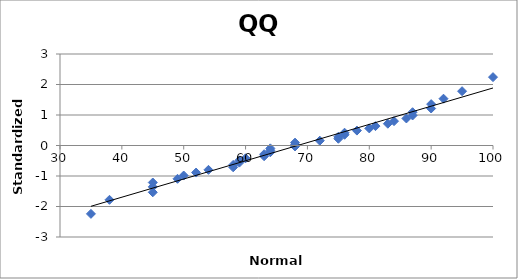
| Category | Series 0 |
|---|---|
| 35.0 | -2.241 |
| 38.0 | -1.78 |
| 45.0 | -1.534 |
| 45.0 | -1.356 |
| 45.0 | -1.213 |
| 49.0 | -1.092 |
| 50.0 | -0.984 |
| 52.0 | -0.887 |
| 54.0 | -0.798 |
| 58.0 | -0.714 |
| 58.0 | -0.636 |
| 59.0 | -0.561 |
| 59.0 | -0.489 |
| 60.0 | -0.419 |
| 63.0 | -0.352 |
| 63.0 | -0.286 |
| 64.0 | -0.221 |
| 64.0 | -0.157 |
| 64.0 | -0.094 |
| 68.0 | -0.031 |
| 68.0 | 0.031 |
| 68.0 | 0.094 |
| 72.0 | 0.157 |
| 75.0 | 0.221 |
| 75.0 | 0.286 |
| 76.0 | 0.352 |
| 76.0 | 0.419 |
| 78.0 | 0.489 |
| 80.0 | 0.561 |
| 81.0 | 0.636 |
| 83.0 | 0.714 |
| 84.0 | 0.798 |
| 86.0 | 0.887 |
| 87.0 | 0.984 |
| 87.0 | 1.092 |
| 90.0 | 1.213 |
| 90.0 | 1.356 |
| 92.0 | 1.534 |
| 95.0 | 1.78 |
| 100.0 | 2.241 |